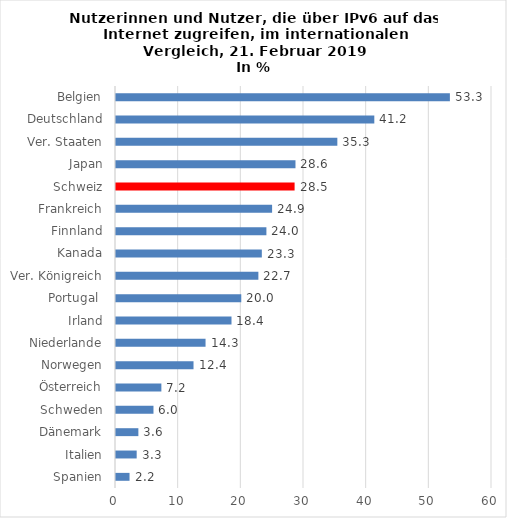
| Category | Series 0 |
|---|---|
| Spanien | 2.16 |
| Italien | 3.3 |
| Dänemark | 3.57 |
| Schweden | 5.98 |
| Österreich | 7.24 |
| Norwegen | 12.37 |
| Niederlande | 14.29 |
| Irland | 18.43 |
| Portugal  | 19.99 |
| Ver. Königreich | 22.72 |
| Kanada | 23.27 |
| Finnland | 24 |
| Frankreich | 24.91 |
| Schweiz | 28.5 |
| Japan | 28.64 |
| Ver. Staaten | 35.32 |
| Deutschland | 41.22 |
| Belgien | 53.28 |